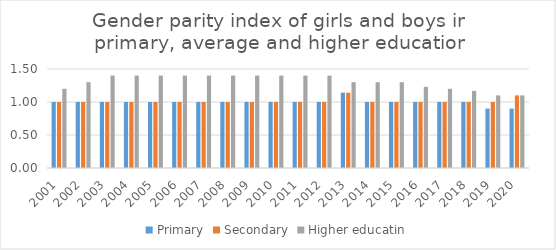
| Category | Primary | Secondary | Higher educatin |
|---|---|---|---|
| 2001.0 | 1 | 1 | 1.2 |
| 2002.0 | 1 | 1 | 1.3 |
| 2003.0 | 1 | 1 | 1.4 |
| 2004.0 | 1 | 1 | 1.4 |
| 2005.0 | 1 | 1 | 1.4 |
| 2006.0 | 1 | 1 | 1.4 |
| 2007.0 | 1 | 1 | 1.4 |
| 2008.0 | 1 | 1 | 1.4 |
| 2009.0 | 1 | 1 | 1.4 |
| 2010.0 | 1 | 1 | 1.4 |
| 2011.0 | 1 | 1 | 1.4 |
| 2012.0 | 1 | 1 | 1.4 |
| 2013.0 | 1.142 | 1.142 | 1.3 |
| 2014.0 | 1 | 1 | 1.3 |
| 2015.0 | 1 | 1 | 1.3 |
| 2016.0 | 1 | 1 | 1.23 |
| 2017.0 | 1 | 1 | 1.2 |
| 2018.0 | 1 | 1 | 1.168 |
| 2019.0 | 0.9 | 1 | 1.1 |
| 2020.0 | 0.9 | 1.1 | 1.1 |